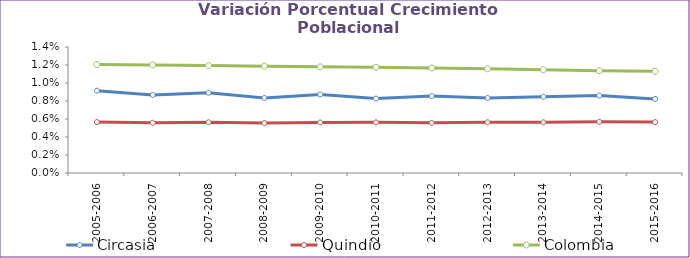
| Category | Circasia | Quindío | Colombia |
|---|---|---|---|
| 2005-2006 | 0.009 | 0.006 | 0.012 |
| 2006-2007 | 0.009 | 0.006 | 0.012 |
| 2007-2008 | 0.009 | 0.006 | 0.012 |
| 2008-2009 | 0.008 | 0.006 | 0.012 |
| 2009-2010 | 0.009 | 0.006 | 0.012 |
| 2010-2011 | 0.008 | 0.006 | 0.012 |
| 2011-2012 | 0.009 | 0.006 | 0.012 |
| 2012-2013 | 0.008 | 0.006 | 0.012 |
| 2013-2014 | 0.008 | 0.006 | 0.011 |
| 2014-2015 | 0.009 | 0.006 | 0.011 |
| 2015-2016 | 0.008 | 0.006 | 0.011 |